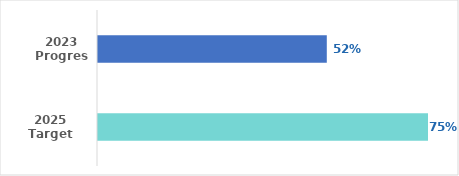
| Category | Series 0 |
|---|---|
| 2023 Progress | 0.52 |
| 2025 Target | 0.75 |